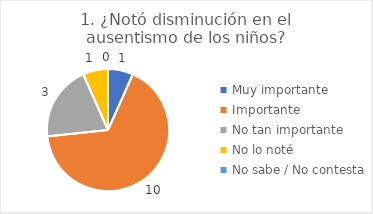
| Category | 1. ¿Notó disminución en el ausentismo de los niños? |
|---|---|
| Muy importante  | 0.067 |
| Importante  | 0.667 |
| No tan importante  | 0.2 |
| No lo noté  | 0.067 |
| No sabe / No contesta | 0 |